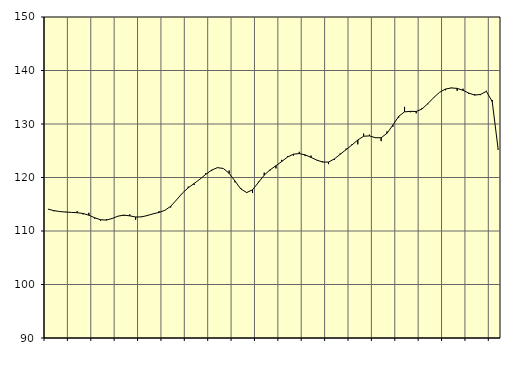
| Category | Piggar | Samtliga anställda (inkl. anställda utomlands) |
|---|---|---|
| nan | 114.1 | 114.1 |
| 1.0 | 113.7 | 113.81 |
| 1.0 | 113.6 | 113.64 |
| 1.0 | 113.6 | 113.54 |
| nan | 113.5 | 113.48 |
| 2.0 | 113.7 | 113.42 |
| 2.0 | 113.1 | 113.28 |
| 2.0 | 113.4 | 112.95 |
| nan | 112.3 | 112.47 |
| 3.0 | 111.9 | 112.11 |
| 3.0 | 112.2 | 112.04 |
| 3.0 | 112.3 | 112.34 |
| nan | 112.8 | 112.78 |
| 4.0 | 112.8 | 112.97 |
| 4.0 | 113.1 | 112.83 |
| 4.0 | 112.1 | 112.62 |
| nan | 112.7 | 112.64 |
| 5.0 | 113 | 112.89 |
| 5.0 | 113.2 | 113.21 |
| 5.0 | 113.7 | 113.47 |
| nan | 113.9 | 113.86 |
| 6.0 | 114.4 | 114.62 |
| 6.0 | 115.8 | 115.82 |
| 6.0 | 117.1 | 117.08 |
| nan | 118.3 | 118.07 |
| 7.0 | 118.6 | 118.87 |
| 7.0 | 119.7 | 119.69 |
| 7.0 | 120.8 | 120.59 |
| nan | 121.2 | 121.38 |
| 8.0 | 121.9 | 121.84 |
| 8.0 | 121.7 | 121.69 |
| 8.0 | 121.3 | 120.78 |
| nan | 119.1 | 119.34 |
| 9.0 | 118 | 117.85 |
| 9.0 | 117.1 | 117.19 |
| 9.0 | 117.1 | 117.7 |
| nan | 119.2 | 119.06 |
| 10.0 | 120.9 | 120.45 |
| 10.0 | 121.3 | 121.43 |
| 10.0 | 121.7 | 122.2 |
| nan | 123.3 | 123 |
| 11.0 | 124 | 123.83 |
| 11.0 | 124.1 | 124.36 |
| 11.0 | 124.8 | 124.47 |
| nan | 124 | 124.23 |
| 12.0 | 124.1 | 123.76 |
| 12.0 | 123.2 | 123.25 |
| 12.0 | 123 | 122.88 |
| nan | 122.5 | 122.89 |
| 13.0 | 123.3 | 123.47 |
| 13.0 | 124.5 | 124.34 |
| 13.0 | 125.4 | 125.21 |
| nan | 126.2 | 126.08 |
| 14.0 | 126.2 | 127.01 |
| 14.0 | 128.2 | 127.71 |
| 14.0 | 128 | 127.78 |
| nan | 127.5 | 127.44 |
| 15.0 | 126.8 | 127.43 |
| 15.0 | 128.6 | 128.26 |
| 15.0 | 129.5 | 129.8 |
| nan | 131.2 | 131.43 |
| 16.0 | 133.2 | 132.27 |
| 16.0 | 132.2 | 132.36 |
| 16.0 | 132 | 132.34 |
| nan | 133 | 132.81 |
| 17.0 | 133.7 | 133.82 |
| 17.0 | 135 | 134.95 |
| 17.0 | 135.9 | 135.93 |
| nan | 136.3 | 136.53 |
| 18.0 | 136.8 | 136.74 |
| 18.0 | 136.2 | 136.66 |
| 18.0 | 136.6 | 136.3 |
| nan | 135.6 | 135.77 |
| 19.0 | 135.6 | 135.4 |
| 19.0 | 135.4 | 135.53 |
| 19.0 | 136.2 | 136.1 |
| nan | 134.5 | 134.19 |
| 20.0 | 125.2 | 125.39 |